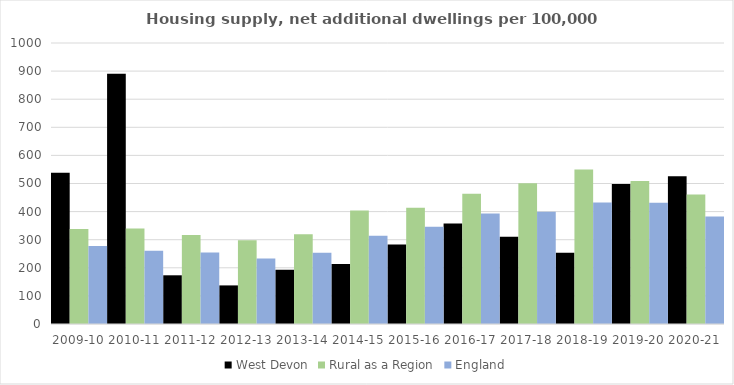
| Category | West Devon | Rural as a Region | England |
|---|---|---|---|
| 2009-10 | 538.511 | 337.852 | 277.548 |
| 2010-11 | 890.87 | 340.105 | 260.994 |
| 2011-12 | 173.33 | 317.04 | 254.007 |
| 2012-13 | 137.327 | 297.763 | 233.153 |
| 2013-14 | 192.657 | 319.835 | 253.602 |
| 2014-15 | 213.459 | 403.796 | 314.256 |
| 2015-16 | 282.558 | 414.091 | 346.154 |
| 2016-17 | 358.043 | 463.209 | 393.256 |
| 2017-18 | 310.868 | 500.68 | 399.646 |
| 2018-19 | 253.926 | 549.491 | 432.099 |
| 2019-20 | 498.244 | 508.493 | 431.187 |
| 2020-21 | 525.481 | 461.114 | 382.827 |